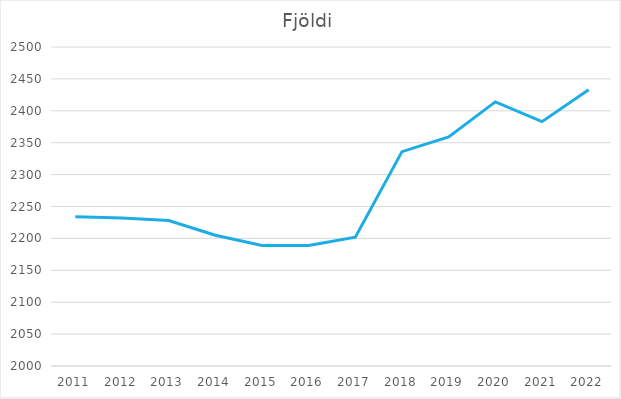
| Category | Fjöldi |
|---|---|
| 2011 | 2234 |
| 2012 | 2232 |
| 2013 | 2228 |
| 2014 | 2205 |
| 2015 | 2189 |
| 2016 | 2189 |
| 2017 | 2202 |
| 2018 | 2336 |
| 2019 | 2359 |
| 2020 | 2414 |
| 2021 | 2383 |
| 2022 | 2433 |